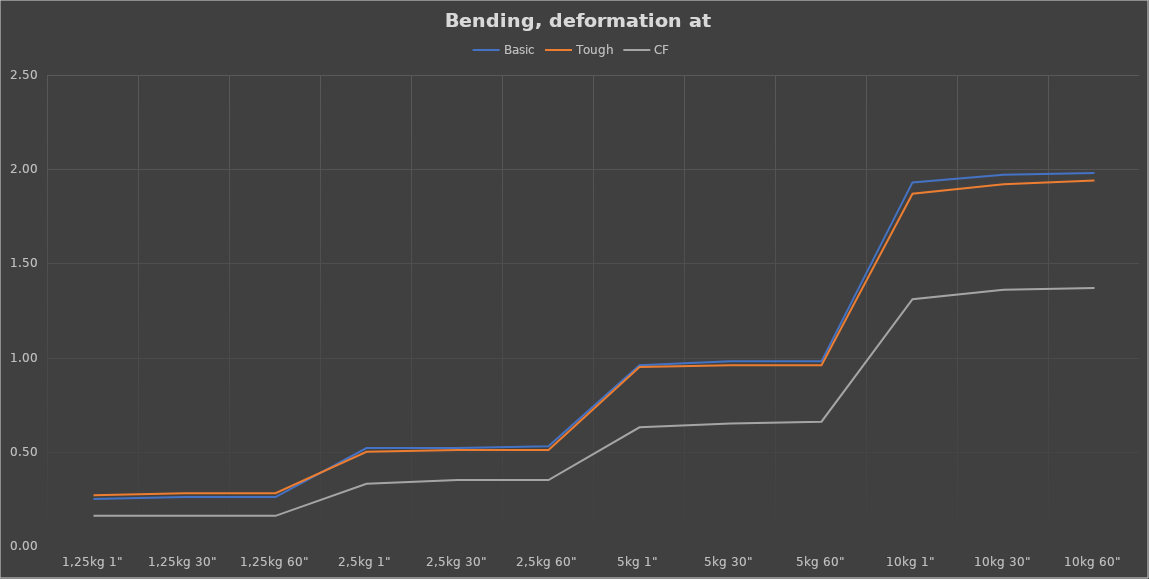
| Category | Basic | Tough | CF |
|---|---|---|---|
| 1,25kg 1" | 0.25 | 0.27 | 0.16 |
| 1,25kg 30" | 0.26 | 0.28 | 0.16 |
| 1,25kg 60" | 0.26 | 0.28 | 0.16 |
| 2,5kg 1" | 0.52 | 0.5 | 0.33 |
| 2,5kg 30" | 0.52 | 0.51 | 0.35 |
| 2,5kg 60" | 0.53 | 0.51 | 0.35 |
| 5kg 1" | 0.96 | 0.95 | 0.63 |
| 5kg 30" | 0.98 | 0.96 | 0.65 |
| 5kg 60" | 0.98 | 0.96 | 0.66 |
| 10kg 1" | 1.93 | 1.87 | 1.31 |
| 10kg 30" | 1.97 | 1.92 | 1.36 |
| 10kg 60" | 1.98 | 1.94 | 1.37 |